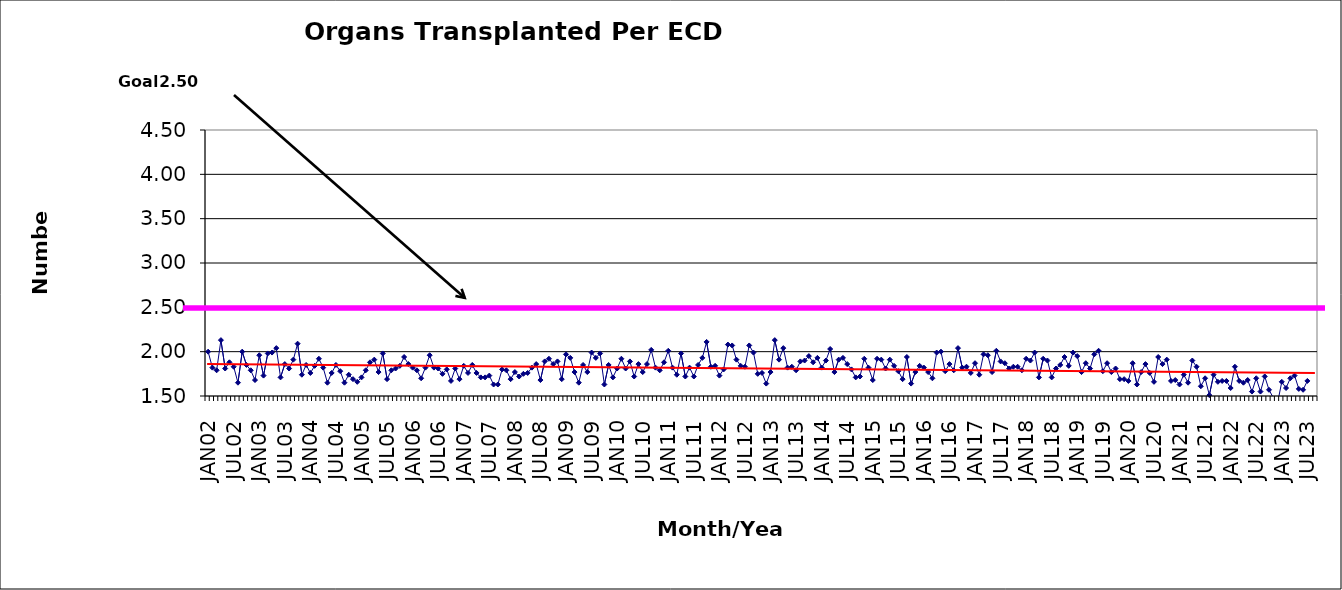
| Category | Series 0 |
|---|---|
| JAN02 | 2 |
| FEB02 | 1.82 |
| MAR02 | 1.79 |
| APR02 | 2.13 |
| MAY02 | 1.81 |
| JUN02 | 1.88 |
| JUL02 | 1.83 |
| AUG02 | 1.65 |
| SEP02 | 2 |
| OCT02 | 1.85 |
| NOV02 | 1.79 |
| DEC02 | 1.68 |
| JAN03 | 1.96 |
| FEB03 | 1.73 |
| MAR03 | 1.98 |
| APR03 | 1.99 |
| MAY03 | 2.04 |
| JUN03 | 1.71 |
| JUL03 | 1.86 |
| AUG03 | 1.81 |
| SEP03 | 1.91 |
| OCT03 | 2.09 |
| NOV03 | 1.74 |
| DEC03 | 1.85 |
| JAN04 | 1.76 |
| FEB04 | 1.84 |
| MAR04 | 1.92 |
| APR04 | 1.82 |
| MAY04 | 1.65 |
| JUN04 | 1.76 |
| JUL04 | 1.85 |
| AUG04 | 1.78 |
| SEP04 | 1.65 |
| OCT04 | 1.74 |
| NOV04 | 1.69 |
| DEC04 | 1.66 |
| JAN05 | 1.71 |
| FEB05 | 1.79 |
| MAR05 | 1.88 |
| APR05 | 1.91 |
| MAY05 | 1.77 |
| JUN05 | 1.98 |
| JUL05 | 1.69 |
| AUG05 | 1.79 |
| SEP05 | 1.81 |
| OCT05 | 1.84 |
| NOV05 | 1.94 |
| DEC05 | 1.86 |
| JAN06 | 1.82 |
| FEB06 | 1.79 |
| MAR06 | 1.7 |
| APR06 | 1.82 |
| MAY06 | 1.96 |
| JUN06 | 1.82 |
| JUL06 | 1.81 |
| AUG06 | 1.75 |
| SEP06 | 1.8 |
| OCT06 | 1.67 |
| NOV06 | 1.81 |
| DEC06 | 1.69 |
| JAN07 | 1.84 |
| FEB07 | 1.76 |
| MAR07 | 1.85 |
| APR07 | 1.76 |
| MAY07 | 1.71 |
| JUN07 | 1.71 |
| JUL07 | 1.73 |
| AUG07 | 1.63 |
| SEP07 | 1.63 |
| OCT07 | 1.8 |
| NOV07 | 1.79 |
| DEC07 | 1.69 |
| JAN08 | 1.77 |
| FEB08 | 1.72 |
| MAR08 | 1.75 |
| APR08 | 1.76 |
| MAY08 | 1.82 |
| JUN08 | 1.86 |
| JUL08 | 1.68 |
| AUG08 | 1.89 |
| SEP08 | 1.92 |
| OCT08 | 1.86 |
| NOV08 | 1.89 |
| DEC08 | 1.69 |
| JAN09 | 1.97 |
| FEB09 | 1.93 |
| MAR09 | 1.77 |
| APR09 | 1.65 |
| MAY09 | 1.85 |
| JUN09 | 1.77 |
| JUL09 | 1.99 |
| AUG09 | 1.93 |
| SEP09 | 1.98 |
| OCT09 | 1.63 |
| NOV09 | 1.85 |
| DEC09 | 1.71 |
| JAN10 | 1.81 |
| FEB10 | 1.92 |
| MAR10 | 1.81 |
| APR10 | 1.89 |
| MAY10 | 1.72 |
| JUN10 | 1.86 |
| JUL10 | 1.77 |
| AUG10 | 1.86 |
| SEP10 | 2.02 |
| OCT10 | 1.82 |
| NOV10 | 1.79 |
| DEC10 | 1.88 |
| JAN11 | 2.01 |
| FEB11 | 1.82 |
| MAR11 | 1.74 |
| APR11 | 1.98 |
| MAY11 | 1.72 |
| JUN11 | 1.82 |
| JUL11 | 1.72 |
| AUG11 | 1.85 |
| SEP11 | 1.93 |
| OCT11 | 2.11 |
| NOV11 | 1.83 |
| DEC11 | 1.84 |
| JAN12 | 1.73 |
| FEB12 | 1.8 |
| MAR12 | 2.08 |
| APR12 | 2.07 |
| MAY12 | 1.91 |
| JUN12 | 1.84 |
| JUL12 | 1.83 |
| AUG12 | 2.07 |
| SEP12 | 1.99 |
| OCT12 | 1.75 |
| NOV12 | 1.76 |
| DEC12 | 1.64 |
| JAN13 | 1.77 |
| FEB13 | 2.13 |
| MAR13 | 1.91 |
| APR13 | 2.04 |
| MAY13 | 1.82 |
| JUN13 | 1.83 |
| JUL13 | 1.79 |
| AUG13 | 1.89 |
| SEP13 | 1.9 |
| OCT13 | 1.95 |
| NOV13 | 1.88 |
| DEC13 | 1.93 |
| JAN14 | 1.82 |
| FEB14 | 1.9 |
| MAR14 | 2.03 |
| APR14 | 1.77 |
| MAY14 | 1.91 |
| JUN14 | 1.93 |
| JUL14 | 1.86 |
| AUG14 | 1.8 |
| SEP14 | 1.71 |
| OCT14 | 1.72 |
| NOV14 | 1.92 |
| DEC14 | 1.82 |
| JAN15 | 1.68 |
| FEB15 | 1.92 |
| MAR15 | 1.91 |
| APR15 | 1.81 |
| MAY15 | 1.91 |
| JUN15 | 1.84 |
| JUL15 | 1.78 |
| AUG15 | 1.69 |
| SEP15 | 1.94 |
| OCT15 | 1.64 |
| NOV15 | 1.77 |
| DEC15 | 1.84 |
| JAN16 | 1.82 |
| FEB16 | 1.77 |
| MAR16 | 1.7 |
| APR16 | 1.99 |
| MAY16 | 2 |
| JUN16 | 1.78 |
| JUL16 | 1.86 |
| AUG16 | 1.79 |
| SEP16 | 2.04 |
| OCT16 | 1.82 |
| NOV16 | 1.83 |
| DEC16 | 1.76 |
| JAN17 | 1.87 |
| FEB17 | 1.74 |
| MAR17 | 1.97 |
| APR17 | 1.96 |
| MAY17 | 1.77 |
| JUN17 | 2.01 |
| JUL17 | 1.89 |
| AUG17 | 1.87 |
| SEP17 | 1.81 |
| OCT17 | 1.83 |
| NOV17 | 1.83 |
| DEC17 | 1.79 |
| JAN18 | 1.92 |
| FEB18 | 1.9 |
| MAR18 | 1.99 |
| APR18 | 1.71 |
| MAY18 | 1.92 |
| JUN18 | 1.9 |
| JUL18 | 1.71 |
| AUG18 | 1.81 |
| SEP18 | 1.85 |
| OCT18 | 1.94 |
| NOV18 | 1.84 |
| DEC18 | 1.99 |
| JAN19 | 1.95 |
| FEB19 | 1.77 |
| MAR19 | 1.87 |
| APR19 | 1.81 |
| MAY19 | 1.97 |
| JUN19 | 2.01 |
| JUL19 | 1.78 |
| AUG19 | 1.87 |
| SEP19 | 1.77 |
| OCT19 | 1.81 |
| NOV19 | 1.69 |
| DEC19 | 1.69 |
| JAN20 | 1.67 |
| FEB20 | 1.87 |
| MAR20 | 1.63 |
| APR20 | 1.77 |
| MAY20 | 1.86 |
| JUN20 | 1.76 |
| JUL20 | 1.66 |
| AUG20 | 1.94 |
| SEP20 | 1.86 |
| OCT20 | 1.91 |
| NOV20 | 1.67 |
| DEC20 | 1.68 |
| JAN21 | 1.63 |
| FEB21 | 1.74 |
| MAR21 | 1.65 |
| APR21 | 1.9 |
| MAY21 | 1.83 |
| JUN21 | 1.61 |
| JUL21 | 1.7 |
| AUG21 | 1.51 |
| SEP21 | 1.74 |
| OCT21 | 1.66 |
| NOV21 | 1.67 |
| DEC21 | 1.67 |
| JAN22 | 1.59 |
| FEB22 | 1.83 |
| MAR22 | 1.67 |
| APR22 | 1.65 |
| MAY22 | 1.68 |
| JUN22 | 1.55 |
| JUL22 | 1.7 |
| AUG22 | 1.55 |
| SEP22 | 1.72 |
| OCT22 | 1.57 |
| NOV22 | 1.48 |
| DEC22 | 1.42 |
| JAN23 | 1.66 |
| FEB23 | 1.59 |
| MAR23 | 1.7 |
| APR23 | 1.73 |
| MAY23 | 1.58 |
| JUN23 | 1.57 |
| JUL23 | 1.67 |